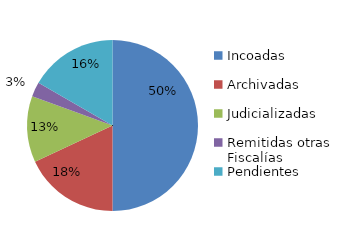
| Category | Series 0 |
|---|---|
| Incoadas | 36 |
| Archivadas | 13 |
| Judicializadas | 9 |
| Remitidas otras Fiscalías | 2 |
| Pendientes | 12 |